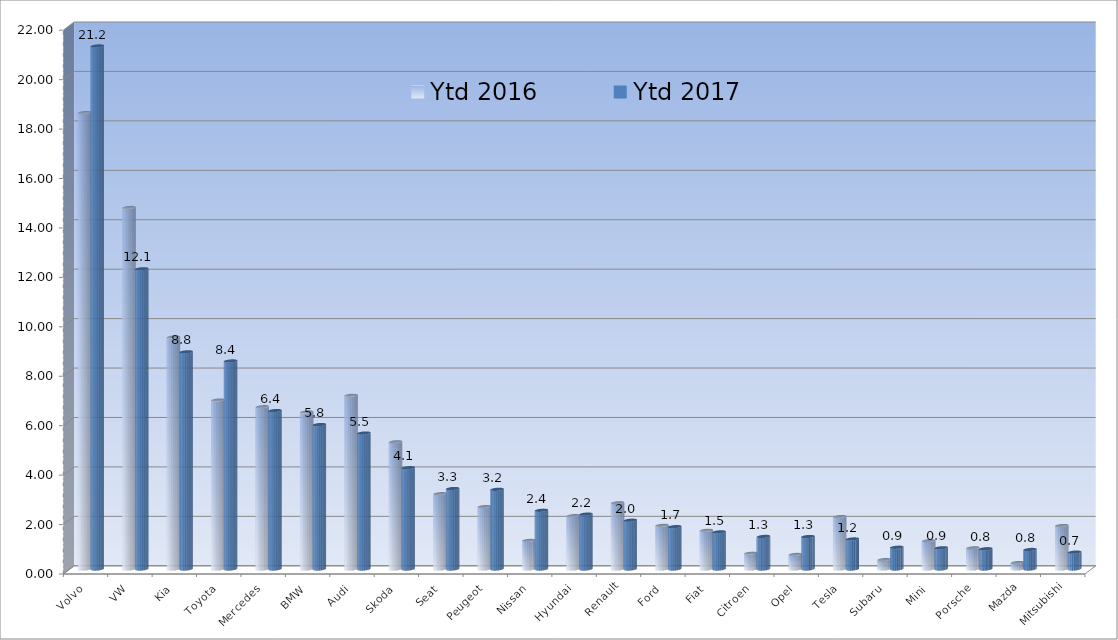
| Category | Ytd 2016 | Ytd 2017 |
|---|---|---|
| Volvo | 18.465 | 21.161 |
| VW | 14.627 | 12.145 |
| Kia | 9.383 | 8.785 |
| Toyota | 6.833 | 8.416 |
| Mercedes | 6.565 | 6.409 |
| BMW | 6.352 | 5.842 |
| Audi | 7.027 | 5.501 |
| Skoda | 5.146 | 4.1 |
| Seat | 3.046 | 3.255 |
| Peugeot | 2.525 | 3.224 |
| Nissan | 1.157 | 2.376 |
| Hyundai | 2.157 | 2.22 |
| Renault | 2.678 | 1.973 |
| Ford | 1.766 | 1.714 |
| Fiat | 1.565 | 1.503 |
| Citroen | 0.64 | 1.317 |
| Opel | 0.589 | 1.314 |
| Tesla | 2.121 | 1.215 |
| Subaru | 0.38 | 0.88 |
| Mini | 1.143 | 0.859 |
| Porsche | 0.856 | 0.82 |
| Mazda | 0.26 | 0.789 |
| Mitsubishi | 1.759 | 0.683 |